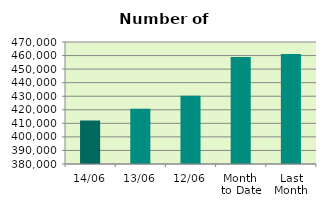
| Category | Series 0 |
|---|---|
| 14/06 | 412094 |
| 13/06 | 420672 |
| 12/06 | 430386 |
| Month 
to Date | 458942 |
| Last
Month | 461152.818 |